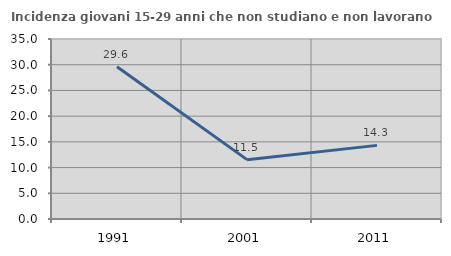
| Category | Incidenza giovani 15-29 anni che non studiano e non lavorano  |
|---|---|
| 1991.0 | 29.6 |
| 2001.0 | 11.542 |
| 2011.0 | 14.314 |